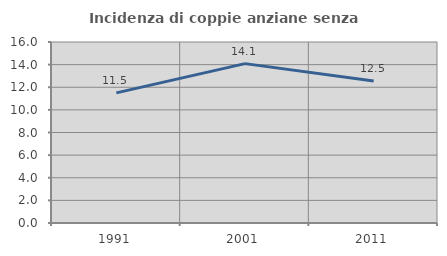
| Category | Incidenza di coppie anziane senza figli  |
|---|---|
| 1991.0 | 11.506 |
| 2001.0 | 14.088 |
| 2011.0 | 12.543 |